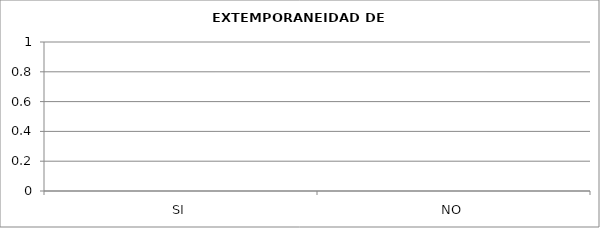
| Category | CANTIDAD |
|---|---|
| SI | 0 |
| NO | 0 |